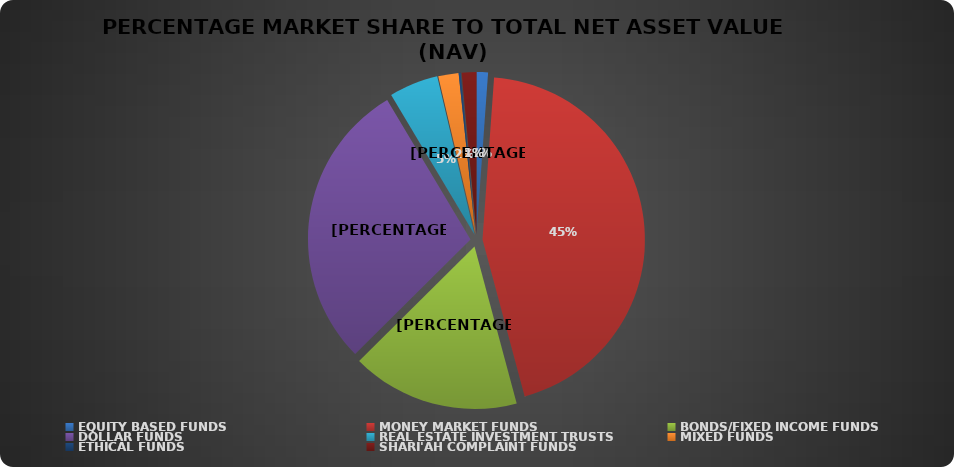
| Category | NET ASSET VALUE |
|---|---|
| EQUITY BASED FUNDS | 21798118395 |
| MONEY MARKET FUNDS | 856179741726.492 |
| BONDS/FIXED INCOME FUNDS | 320872331713.326 |
| DOLLAR FUNDS | 553123134779.057 |
| REAL ESTATE INVESTMENT TRUSTS | 93574800912.41 |
| MIXED FUNDS | 38884096485.686 |
| ETHICAL FUNDS | 3796886715.43 |
| SHARI'AH COMPLAINT FUNDS | 27962550206.07 |